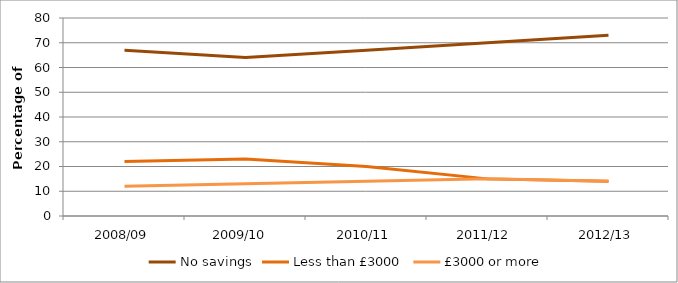
| Category | No savings | Less than £3000 | £3000 or more  |
|---|---|---|---|
| 2008/09 | 67 | 22 | 12 |
| 2009/10  | 64 | 23 | 13 |
| 2010/11 | 67 | 20 | 14 |
| 2011/12 | 70 | 15 | 15 |
| 2012/13 | 73 | 14 | 14 |